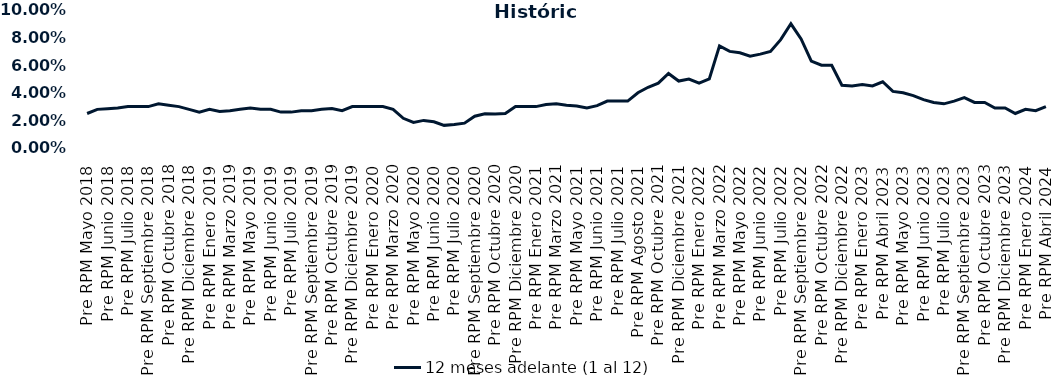
| Category | 12 meses adelante (1 al 12)  |
|---|---|
| Pre RPM Mayo 2018 | 0.025 |
| Post RPM Mayo 2018 | 0.028 |
| Pre RPM Junio 2018 | 0.028 |
| Post RPM Junio 2018 | 0.029 |
| Pre RPM Julio 2018 | 0.03 |
| Post RPM Julio 2018 | 0.03 |
| Pre RPM Septiembre 2018 | 0.03 |
| Post RPM Septiembre 2018 | 0.032 |
| Pre RPM Octubre 2018 | 0.031 |
| Post RPM Octubre 2018 | 0.03 |
| Pre RPM Diciembre 2018 | 0.028 |
| Post RPM Diciembre 2018 | 0.026 |
| Pre RPM Enero 2019 | 0.028 |
| Post RPM Enero 2019 | 0.026 |
| Pre RPM Marzo 2019 | 0.027 |
| Post RPM Marzo 2019 | 0.028 |
| Pre RPM Mayo 2019 | 0.029 |
| Post RPM Mayo 2019 | 0.028 |
| Pre RPM Junio 2019 | 0.028 |
| Post RPM Junio 2019 | 0.026 |
| Pre RPM Julio 2019 | 0.026 |
| Post RPM Julio 2019 | 0.027 |
| Pre RPM Septiembre 2019 | 0.027 |
| Post RPM Septiembre 2019 | 0.028 |
| Pre RPM Octubre 2019 | 0.029 |
| Post RPM Octubre 2019 | 0.027 |
| Pre RPM Diciembre 2019 | 0.03 |
| Post RPM Diciembre 2019 | 0.03 |
| Pre RPM Enero 2020 | 0.03 |
| Post RPM Enero 2020 | 0.03 |
| Pre RPM Marzo 2020 | 0.028 |
| Post RPM Marzo 2020 | 0.022 |
| Pre RPM Mayo 2020 | 0.018 |
| Post RPM Mayo 2020 | 0.02 |
| Pre RPM Junio 2020 | 0.019 |
| Post RPM Junio 2020 | 0.016 |
| Pre RPM Julio 2020 | 0.017 |
| Post RPM Julio 2020 | 0.018 |
| Pre RPM Septiembre 2020 | 0.023 |
| Post RPM Septiembre 2020 | 0.025 |
| Pre RPM Octubre 2020 | 0.025 |
| Post RPM Octubre 2020 | 0.025 |
| Pre RPM Diciembre 2020 | 0.03 |
| Post RPM Diciembre 2020 | 0.03 |
| Pre RPM Enero 2021 | 0.03 |
| Post RPM Enero 2021 | 0.032 |
| Pre RPM Marzo 2021 | 0.032 |
| Post RPM Marzo 2021 | 0.031 |
| Pre RPM Mayo 2021 | 0.03 |
| Post RPM Mayo 2021 | 0.029 |
| Pre RPM Junio 2021 | 0.031 |
| Post RPM Junio 2021 | 0.034 |
| Pre RPM Julio 2021 | 0.034 |
| Post RPM Julio 2021 | 0.034 |
| Pre RPM Agosto 2021 | 0.04 |
| Post RPM Agosto 2021 | 0.044 |
| Pre RPM Octubre 2021 | 0.047 |
| Post RPM Octubre 2021 | 0.054 |
| Pre RPM Diciembre 2021 | 0.048 |
| Post RPM Diciembre 2021 | 0.05 |
| Pre RPM Enero 2022 | 0.047 |
| Post RPM Enero 2022 | 0.05 |
| Pre RPM Marzo 2022 | 0.074 |
| Post RPM Marzo 2022 | 0.07 |
| Pre RPM Mayo 2022 | 0.069 |
| Post RPM Mayo 2022 | 0.066 |
| Pre RPM Junio 2022 | 0.068 |
| Post RPM Junio 2022 | 0.07 |
| Pre RPM Julio 2022 | 0.078 |
| Post RPM Julio 2022 | 0.09 |
| Pre RPM Septiembre 2022 | 0.079 |
| Post RPM Septiembre 2022 | 0.063 |
| Pre RPM Octubre 2022 | 0.06 |
| Post RPM Octubre 2022 | 0.06 |
| Pre RPM Diciembre 2022 | 0.046 |
| Post RPM Diciembre 2022 | 0.045 |
| Pre RPM Enero 2023 | 0.046 |
| Post RPM Enero 2023 | 0.045 |
| Pre RPM Abril 2023 | 0.048 |
| Post RPM Abril 2023 | 0.041 |
| Pre RPM Mayo 2023 | 0.04 |
| Post RPM Mayo 2023 | 0.038 |
| Pre RPM Junio 2023 | 0.035 |
| Post RPM Junio 2023 | 0.033 |
| Pre RPM Julio 2023 | 0.032 |
| Post RPM Julio 2023 | 0.034 |
| Pre RPM Septiembre 2023 | 0.036 |
| Post RPM Septiembre 2023 | 0.033 |
| Pre RPM Octubre 2023 | 0.033 |
| Post RPM Octubre 2023 | 0.029 |
| Pre RPM Diciembre 2023 | 0.029 |
| Post RPM Diciembre 2023 | 0.025 |
| Pre RPM Enero 2024 | 0.028 |
| Post RPM Enero 2024 | 0.027 |
| Pre RPM Abril 2024 | 0.03 |